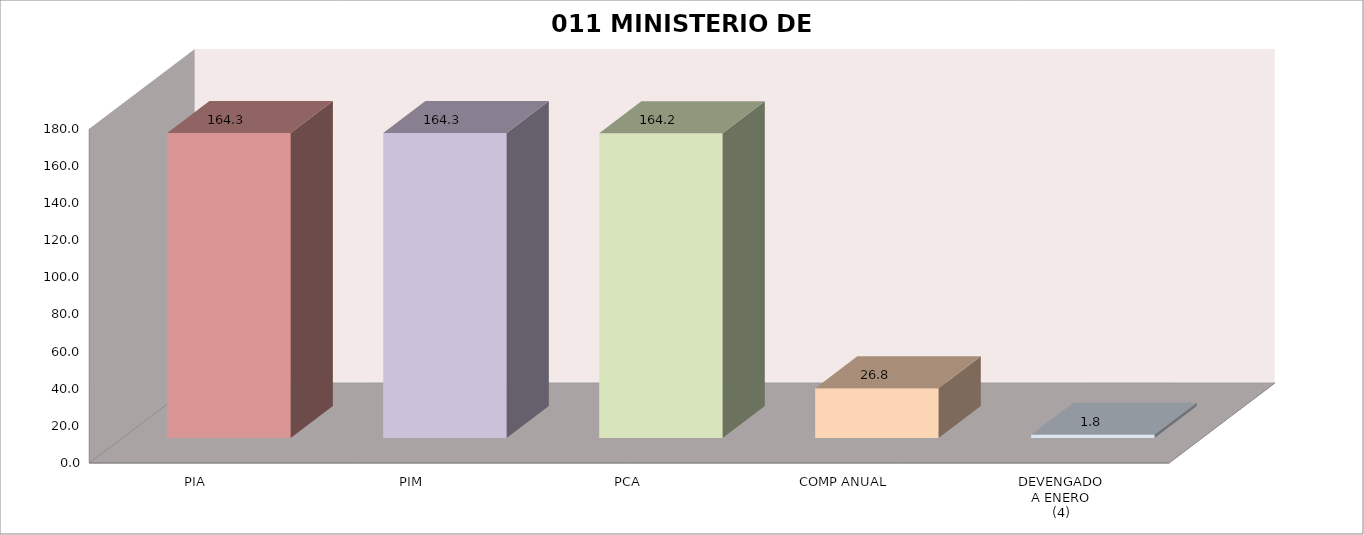
| Category | 011 MINISTERIO DE SALUD |
|---|---|
| PIA | 164.314 |
| PIM | 164.314 |
| PCA | 164.157 |
| COMP ANUAL | 26.823 |
| DEVENGADO
A ENERO
(4) | 1.832 |